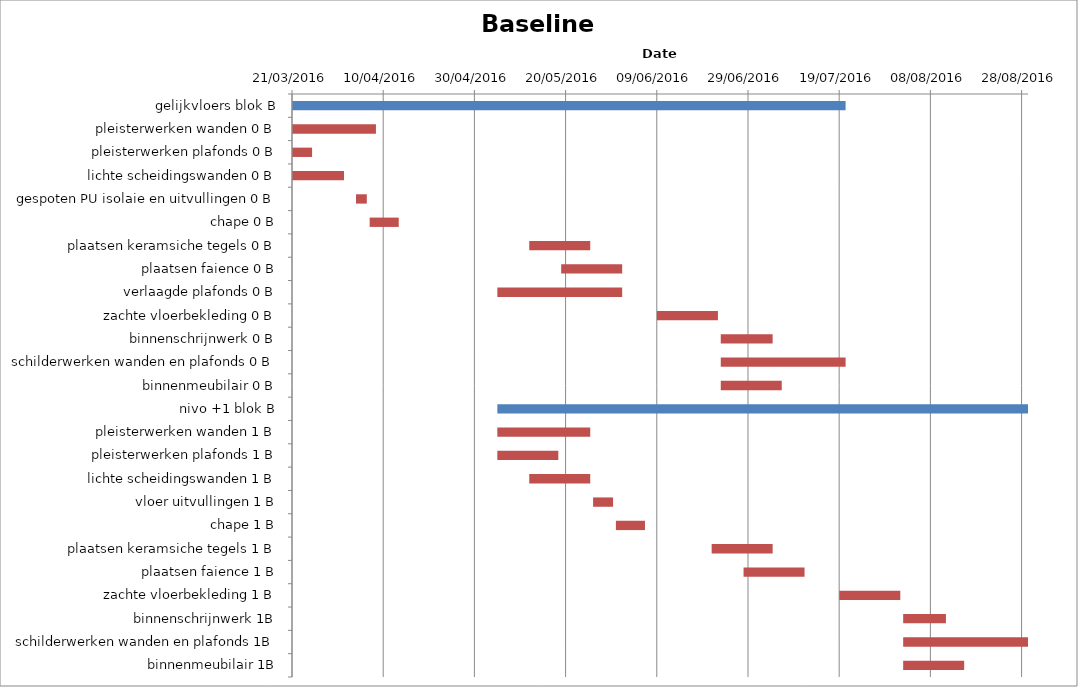
| Category | Baseline start | Actual duration |
|---|---|---|
| gelijkvloers blok B | 42450.333 | 121.375 |
| pleisterwerken wanden 0 B | 42450.333 | 18.375 |
| pleisterwerken plafonds 0 B | 42450.333 | 4.375 |
| lichte scheidingswanden 0 B | 42450.333 | 11.375 |
| gespoten PU isolaie en uitvullingen 0 B | 42464.333 | 2.375 |
| chape 0 B | 42467.333 | 6.375 |
| plaatsen keramsiche tegels 0 B | 42502.333 | 13.375 |
| plaatsen faience 0 B | 42509.333 | 13.375 |
| verlaagde plafonds 0 B | 42495.333 | 27.375 |
| zachte vloerbekleding 0 B | 42530.333 | 13.375 |
| binnenschrijnwerk 0 B | 42544.333 | 11.375 |
| schilderwerken wanden en plafonds 0 B | 42544.333 | 27.375 |
| binnenmeubilair 0 B | 42544.333 | 13.375 |
| nivo +1 blok B | 42495.333 | 116.375 |
| pleisterwerken wanden 1 B | 42495.333 | 20.375 |
| pleisterwerken plafonds 1 B | 42495.333 | 13.375 |
| lichte scheidingswanden 1 B | 42502.333 | 13.375 |
| vloer uitvullingen 1 B | 42516.333 | 4.375 |
| chape 1 B | 42521.333 | 6.375 |
| plaatsen keramsiche tegels 1 B | 42542.333 | 13.375 |
| plaatsen faience 1 B | 42549.333 | 13.375 |
| zachte vloerbekleding 1 B | 42570.333 | 13.375 |
| binnenschrijnwerk 1B | 42584.333 | 9.375 |
| schilderwerken wanden en plafonds 1B | 42584.333 | 27.375 |
| binnenmeubilair 1B | 42584.333 | 13.375 |